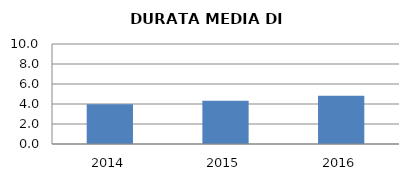
| Category | 2014 2015 2016 |
|---|---|
| 2014.0 | 3.971 |
| 2015.0 | 4.333 |
| 2016.0 | 4.836 |